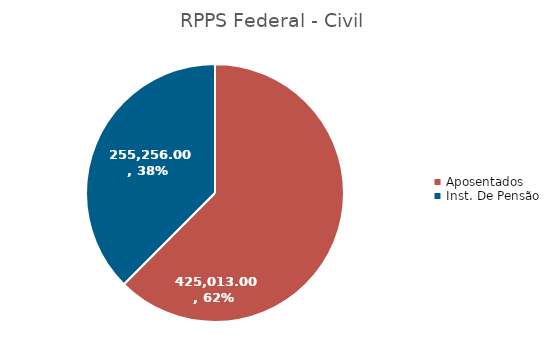
| Category | Series 0 |
|---|---|
| Aposentados | 425013 |
| Inst. De Pensão | 255256 |